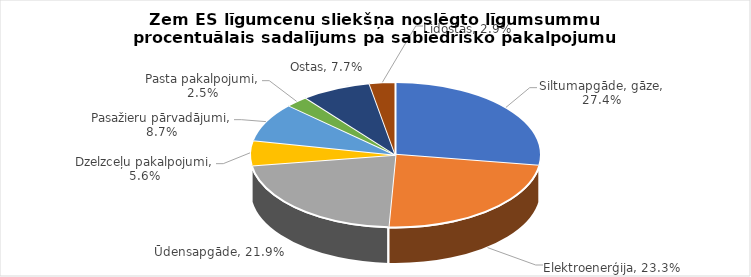
| Category | Series 0 | Series 1 |
|---|---|---|
| Siltumapgāde, gāze | 0.274 | 0.202 |
| Elektroenerģija | 0.233 | 0.415 |
| Ūdensapgāde | 0.219 | 0.227 |
| Dzelzceļu pakalpojumi | 0.056 | 0.005 |
| Pasažieru pārvadājumi | 0.087 | 0.011 |
| Pasta pakalpojumi | 0.025 | 0.001 |
| Ostas | 0.077 | 0.1 |
| Lidostas | 0.029 | 0.04 |